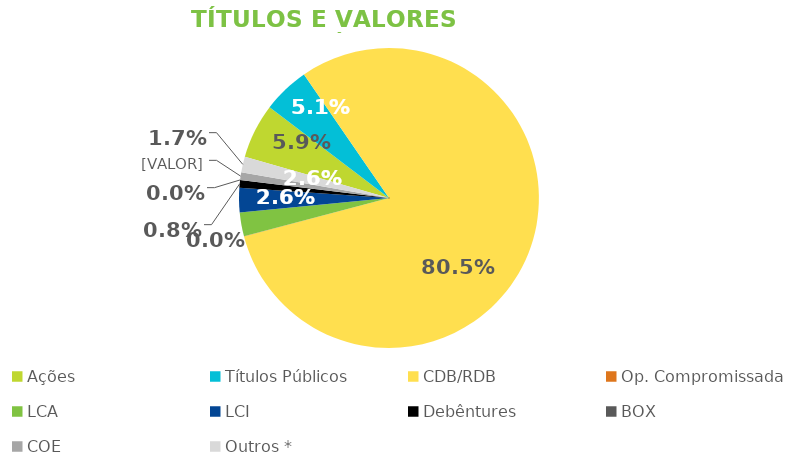
| Category | TVM |
|---|---|
| Ações | 0.059 |
| Títulos Públicos | 0.051 |
| CDB/RDB | 0.805 |
| Op. Compromissada | 0 |
| LCA | 0.026 |
| LCI | 0.026 |
| Debêntures | 0.008 |
| BOX | 0 |
| COE | 0.008 |
| Outros * | 0.017 |